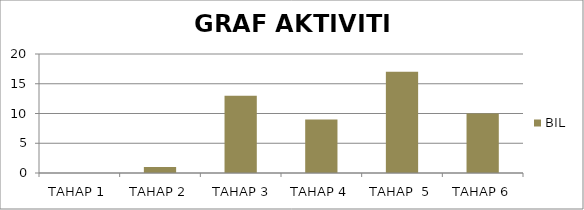
| Category | BIL |
|---|---|
| TAHAP 1 | 0 |
| TAHAP 2 | 1 |
|  TAHAP 3 | 13 |
| TAHAP 4 | 9 |
| TAHAP  5 | 17 |
| TAHAP 6 | 10 |